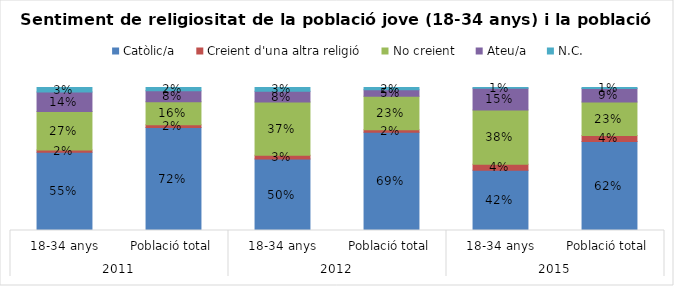
| Category | Catòlic/a | Creient d'una altra religió | No creient | Ateu/a | N.C. |
|---|---|---|---|---|---|
| 0 | 0.547 | 0.016 | 0.268 | 0.137 | 0.032 |
| 1 | 0.72 | 0.02 | 0.161 | 0.075 | 0.023 |
| 2 | 0.5 | 0.025 | 0.373 | 0.076 | 0.025 |
| 3 | 0.687 | 0.018 | 0.234 | 0.046 | 0.015 |
| 4 | 0.422 | 0.042 | 0.38 | 0.151 | 0.006 |
| 5 | 0.622 | 0.042 | 0.235 | 0.094 | 0.007 |